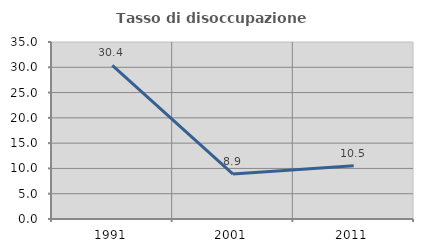
| Category | Tasso di disoccupazione giovanile  |
|---|---|
| 1991.0 | 30.38 |
| 2001.0 | 8.889 |
| 2011.0 | 10.526 |